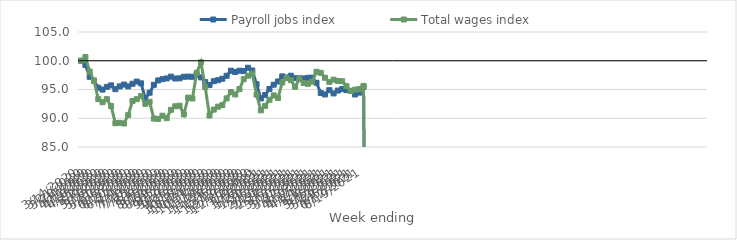
| Category | Payroll jobs index | Total wages index |
|---|---|---|
| 14/03/2020 | 100 | 100 |
| 21/03/2020 | 99.262 | 100.637 |
| 28/03/2020 | 97.208 | 98.107 |
| 04/04/2020 | 96.54 | 96.533 |
| 11/04/2020 | 95.32 | 93.327 |
| 18/04/2020 | 94.981 | 92.788 |
| 25/04/2020 | 95.459 | 93.322 |
| 02/05/2020 | 95.719 | 92.115 |
| 09/05/2020 | 95.055 | 89.129 |
| 16/05/2020 | 95.54 | 89.202 |
| 23/05/2020 | 95.855 | 89.085 |
| 30/05/2020 | 95.541 | 90.538 |
| 06/06/2020 | 96.001 | 92.991 |
| 13/06/2020 | 96.376 | 93.32 |
| 20/06/2020 | 96.074 | 93.866 |
| 27/06/2020 | 93.441 | 92.504 |
| 04/07/2020 | 94.44 | 92.846 |
| 11/07/2020 | 95.815 | 89.94 |
| 18/07/2020 | 96.576 | 89.89 |
| 25/07/2020 | 96.794 | 90.438 |
| 01/08/2020 | 96.926 | 90.018 |
| 08/08/2020 | 97.237 | 91.462 |
| 15/08/2020 | 96.909 | 92.085 |
| 22/08/2020 | 96.945 | 92.179 |
| 29/08/2020 | 97.217 | 90.679 |
| 05/09/2020 | 97.242 | 93.588 |
| 12/09/2020 | 97.216 | 93.436 |
| 19/09/2020 | 97.574 | 97.904 |
| 26/09/2020 | 97.107 | 99.719 |
| 03/10/2020 | 96.286 | 95.41 |
| 10/10/2020 | 95.77 | 90.485 |
| 17/10/2020 | 96.446 | 91.502 |
| 24/10/2020 | 96.621 | 92.017 |
| 31/10/2020 | 96.865 | 92.294 |
| 07/11/2020 | 97.381 | 93.456 |
| 14/11/2020 | 98.265 | 94.547 |
| 21/11/2020 | 98.038 | 94.142 |
| 28/11/2020 | 98.269 | 95.073 |
| 05/12/2020 | 98.205 | 96.793 |
| 12/12/2020 | 98.779 | 97.395 |
| 19/12/2020 | 98.309 | 97.742 |
| 26/12/2020 | 95.906 | 94.102 |
| 02/01/2021 | 93.444 | 91.375 |
| 09/01/2021 | 94.046 | 92.157 |
| 16/01/2021 | 95.094 | 93.208 |
| 23/01/2021 | 95.839 | 93.974 |
| 30/01/2021 | 96.391 | 93.532 |
| 06/02/2021 | 97.282 | 96.218 |
| 13/02/2021 | 97.088 | 96.988 |
| 20/02/2021 | 97.396 | 96.629 |
| 27/02/2021 | 96.971 | 95.459 |
| 06/03/2021 | 96.94 | 96.814 |
| 13/03/2021 | 96.924 | 96.14 |
| 20/03/2021 | 97.04 | 95.988 |
| 27/03/2021 | 97.064 | 96.351 |
| 03/04/2021 | 96.169 | 98.088 |
| 10/04/2021 | 94.385 | 97.895 |
| 17/04/2021 | 94.138 | 97.043 |
| 24/04/2021 | 94.884 | 96.31 |
| 01/05/2021 | 94.316 | 96.714 |
| 08/05/2021 | 94.815 | 96.485 |
| 15/05/2021 | 95.069 | 96.444 |
| 22/05/2021 | 94.888 | 95.588 |
| 29/05/2021 | 94.766 | 94.735 |
| 05/06/2021 | 94.138 | 94.968 |
| 12/06/2021 | 94.453 | 95.067 |
| 19/06/2021 | 95.486 | 95.617 |